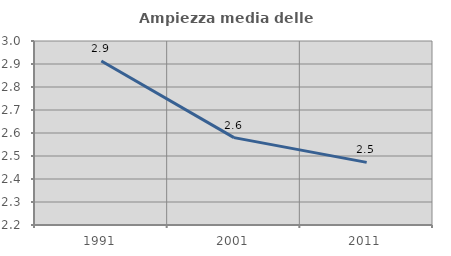
| Category | Ampiezza media delle famiglie |
|---|---|
| 1991.0 | 2.913 |
| 2001.0 | 2.58 |
| 2011.0 | 2.472 |